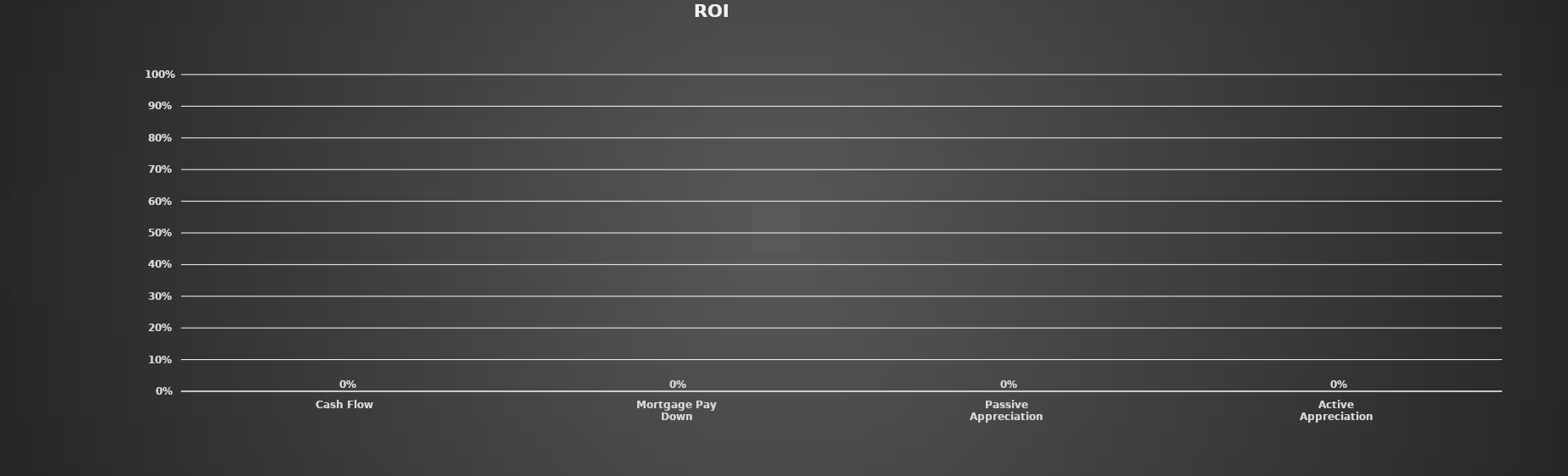
| Category | Series 0 |
|---|---|
| Cash Flow | 0 |
| Mortgage Pay Down | 0 |
| Passive Appreciation | 0 |
| Active Appreciation | 0 |